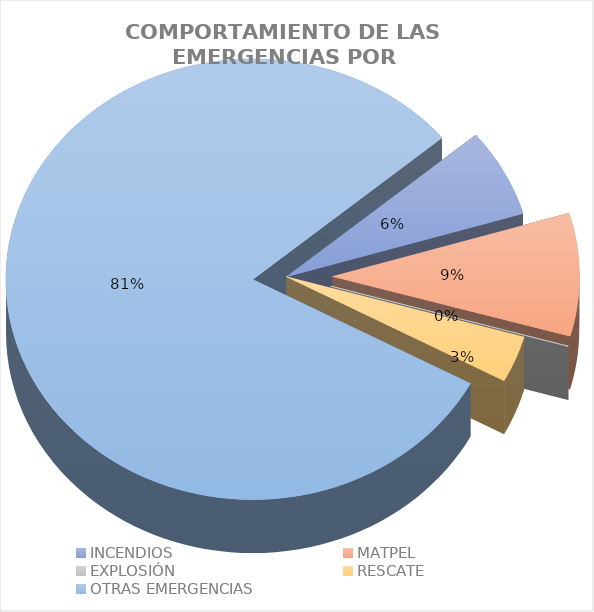
| Category | Series 0 |
|---|---|
| INCENDIOS | 0.065 |
| MATPEL | 0.09 |
| EXPLOSIÓN | 0 |
| RESCATE | 0.034 |
| OTRAS EMERGENCIAS | 0.811 |